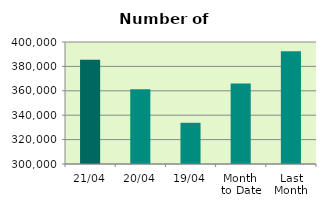
| Category | Series 0 |
|---|---|
| 21/04 | 385530 |
| 20/04 | 361182 |
| 19/04 | 333790 |
| Month 
to Date | 366039.833 |
| Last
Month | 392496.174 |